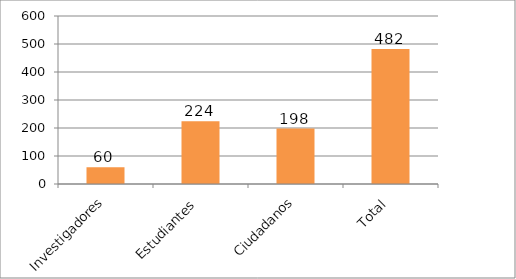
| Category | Series 0 |
|---|---|
| Investigadores | 60 |
| Estudiantes | 224 |
| Ciudadanos | 198 |
| Total | 482 |